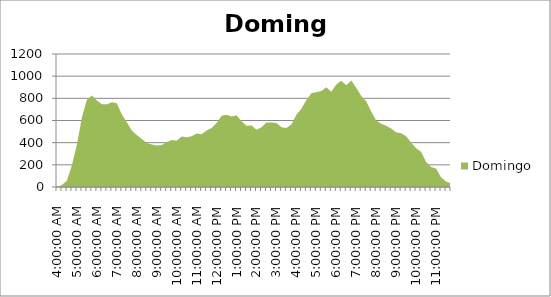
| Category | Domingo |
|---|---|
| 0.16666666666666663 | 0 |
| 0.1770833333333333 | 18 |
| 0.18749999999999994 | 58 |
| 0.1979166666666666 | 198 |
| 0.20833333333333326 | 383 |
| 0.21874999999999992 | 630 |
| 0.22916666666666657 | 788 |
| 0.23958333333333323 | 826 |
| 0.2499999999999999 | 781 |
| 0.2604166666666666 | 747 |
| 0.27083333333333326 | 747 |
| 0.28124999999999994 | 764 |
| 0.29166666666666663 | 756 |
| 0.3020833333333333 | 655 |
| 0.3125 | 585 |
| 0.3229166666666667 | 509 |
| 0.33333333333333337 | 469 |
| 0.34375000000000006 | 433 |
| 0.35416666666666674 | 397 |
| 0.3645833333333334 | 383 |
| 0.3750000000000001 | 375 |
| 0.3854166666666668 | 379 |
| 0.3958333333333335 | 407 |
| 0.40625000000000017 | 424 |
| 0.41666666666666685 | 417 |
| 0.42708333333333354 | 455 |
| 0.4375000000000002 | 449 |
| 0.4479166666666669 | 457 |
| 0.4583333333333336 | 482 |
| 0.4687500000000003 | 477 |
| 0.47916666666666696 | 509 |
| 0.48958333333333365 | 533 |
| 0.5000000000000003 | 577 |
| 0.510416666666667 | 642 |
| 0.5208333333333336 | 653 |
| 0.5312500000000002 | 636 |
| 0.5416666666666669 | 648 |
| 0.5520833333333335 | 593 |
| 0.5625000000000001 | 553 |
| 0.5729166666666667 | 554 |
| 0.5833333333333334 | 516 |
| 0.59375 | 539 |
| 0.6041666666666666 | 583 |
| 0.6145833333333333 | 581 |
| 0.6249999999999999 | 577 |
| 0.6354166666666665 | 539 |
| 0.6458333333333331 | 532 |
| 0.6562499999999998 | 565 |
| 0.6666666666666664 | 652 |
| 0.677083333333333 | 707 |
| 0.6874999999999997 | 784 |
| 0.6979166666666663 | 845 |
| 0.7083333333333329 | 856 |
| 0.7187499999999996 | 866 |
| 0.7291666666666662 | 899 |
| 0.7395833333333328 | 859 |
| 0.7499999999999994 | 925 |
| 0.7604166666666661 | 958 |
| 0.7708333333333327 | 919 |
| 0.7812499999999993 | 962 |
| 0.791666666666666 | 896 |
| 0.8020833333333326 | 822 |
| 0.8124999999999992 | 773 |
| 0.8229166666666659 | 682 |
| 0.8333333333333325 | 600 |
| 0.8437499999999991 | 571 |
| 0.8541666666666657 | 552 |
| 0.8645833333333324 | 528 |
| 0.874999999999999 | 494 |
| 0.8854166666666656 | 484 |
| 0.8958333333333323 | 458 |
| 0.9062499999999989 | 402 |
| 0.9166666666666655 | 350 |
| 0.9270833333333321 | 319 |
| 0.9374999999999988 | 225 |
| 0.9479166666666654 | 181 |
| 0.958333333333332 | 167 |
| 0.9687499999999987 | 87 |
| 0.9791666666666653 | 50 |
| 0.9895833333333319 | 32 |